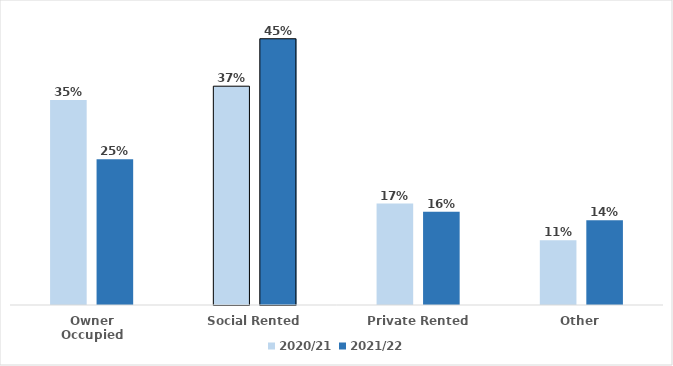
| Category | 2020/21 | 2021/22 |
|---|---|---|
| Owner Occupied | 0.347 | 0.247 |
| Social Rented | 0.371 | 0.451 |
| Private Rented | 0.172 | 0.158 |
| Other | 0.11 | 0.144 |